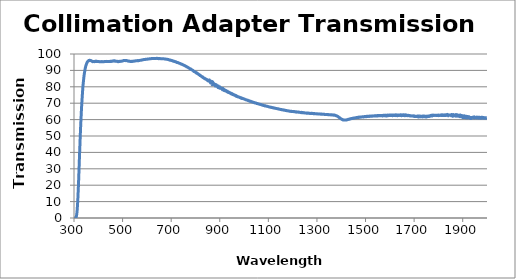
| Category | Collimation Adapter Transmission |
|---|---|
| 300.0 | 0.027 |
| 301.0 | 0.01 |
| 302.0 | 0.011 |
| 303.0 | 0.01 |
| 304.0 | 0.004 |
| 305.0 | 0.014 |
| 306.0 | 0.04 |
| 307.0 | 0.123 |
| 308.0 | 0.339 |
| 309.0 | 0.684 |
| 310.0 | 1.226 |
| 311.0 | 2.072 |
| 312.0 | 3.234 |
| 313.0 | 4.8 |
| 314.0 | 6.85 |
| 315.0 | 9.312 |
| 316.0 | 12.193 |
| 317.0 | 15.516 |
| 318.0 | 18.881 |
| 319.0 | 22.701 |
| 320.0 | 26.847 |
| 321.0 | 30.99 |
| 322.0 | 35.189 |
| 323.0 | 39.184 |
| 324.0 | 43.123 |
| 325.0 | 47.111 |
| 326.0 | 50.904 |
| 327.0 | 54.502 |
| 328.0 | 57.905 |
| 329.0 | 60.99 |
| 330.0 | 64.204 |
| 331.0 | 67.128 |
| 332.0 | 69.625 |
| 333.0 | 71.962 |
| 334.0 | 74.282 |
| 335.0 | 76.564 |
| 336.0 | 78.724 |
| 337.0 | 80.565 |
| 338.0 | 82.145 |
| 339.0 | 83.505 |
| 340.0 | 85.037 |
| 341.0 | 86.343 |
| 342.0 | 87.519 |
| 343.0 | 88.435 |
| 344.0 | 89.249 |
| 345.0 | 90.154 |
| 346.0 | 91.051 |
| 347.0 | 91.713 |
| 348.0 | 92.358 |
| 349.0 | 92.922 |
| 350.0 | 93.368 |
| 351.0 | 93.806 |
| 352.0 | 94.136 |
| 353.0 | 94.531 |
| 354.0 | 94.917 |
| 355.0 | 95.159 |
| 356.0 | 95.26 |
| 357.0 | 95.424 |
| 358.0 | 95.553 |
| 359.0 | 95.713 |
| 360.0 | 95.997 |
| 361.0 | 95.997 |
| 362.0 | 95.914 |
| 363.0 | 96.003 |
| 364.0 | 96.164 |
| 365.0 | 96.152 |
| 366.0 | 96.096 |
| 367.0 | 96.109 |
| 368.0 | 96.063 |
| 369.0 | 95.924 |
| 370.0 | 95.922 |
| 371.0 | 95.95 |
| 372.0 | 95.792 |
| 373.0 | 95.737 |
| 374.0 | 95.565 |
| 375.0 | 95.572 |
| 376.0 | 95.412 |
| 377.0 | 95.279 |
| 378.0 | 95.424 |
| 379.0 | 95.362 |
| 380.0 | 95.382 |
| 381.0 | 95.399 |
| 382.0 | 95.39 |
| 383.0 | 95.509 |
| 384.0 | 95.343 |
| 385.0 | 95.318 |
| 386.0 | 95.409 |
| 387.0 | 95.517 |
| 388.0 | 95.446 |
| 389.0 | 95.386 |
| 390.0 | 95.444 |
| 391.0 | 95.667 |
| 392.0 | 95.514 |
| 393.0 | 95.604 |
| 394.0 | 95.537 |
| 395.0 | 95.442 |
| 396.0 | 95.47 |
| 397.0 | 95.424 |
| 398.0 | 95.469 |
| 399.0 | 95.42 |
| 400.0 | 95.404 |
| 401.0 | 95.341 |
| 402.0 | 95.392 |
| 403.0 | 95.381 |
| 404.0 | 95.325 |
| 405.0 | 95.295 |
| 406.0 | 95.284 |
| 407.0 | 95.323 |
| 408.0 | 95.356 |
| 409.0 | 95.322 |
| 410.0 | 95.343 |
| 411.0 | 95.314 |
| 412.0 | 95.347 |
| 413.0 | 95.308 |
| 414.0 | 95.412 |
| 415.0 | 95.301 |
| 416.0 | 95.273 |
| 417.0 | 95.287 |
| 418.0 | 95.351 |
| 419.0 | 95.313 |
| 420.0 | 95.258 |
| 421.0 | 95.327 |
| 422.0 | 95.316 |
| 423.0 | 95.346 |
| 424.0 | 95.383 |
| 425.0 | 95.462 |
| 426.0 | 95.374 |
| 427.0 | 95.33 |
| 428.0 | 95.408 |
| 429.0 | 95.403 |
| 430.0 | 95.422 |
| 431.0 | 95.42 |
| 432.0 | 95.369 |
| 433.0 | 95.424 |
| 434.0 | 95.498 |
| 435.0 | 95.491 |
| 436.0 | 95.365 |
| 437.0 | 95.475 |
| 438.0 | 95.387 |
| 439.0 | 95.412 |
| 440.0 | 95.385 |
| 441.0 | 95.474 |
| 442.0 | 95.357 |
| 443.0 | 95.428 |
| 444.0 | 95.376 |
| 445.0 | 95.43 |
| 446.0 | 95.425 |
| 447.0 | 95.458 |
| 448.0 | 95.519 |
| 449.0 | 95.432 |
| 450.0 | 95.445 |
| 451.0 | 95.522 |
| 452.0 | 95.623 |
| 453.0 | 95.533 |
| 454.0 | 95.499 |
| 455.0 | 95.495 |
| 456.0 | 95.501 |
| 457.0 | 95.693 |
| 458.0 | 95.671 |
| 459.0 | 95.562 |
| 460.0 | 95.607 |
| 461.0 | 95.742 |
| 462.0 | 95.747 |
| 463.0 | 95.829 |
| 464.0 | 95.701 |
| 465.0 | 95.745 |
| 466.0 | 95.856 |
| 467.0 | 95.797 |
| 468.0 | 95.816 |
| 469.0 | 95.613 |
| 470.0 | 95.633 |
| 471.0 | 95.709 |
| 472.0 | 95.651 |
| 473.0 | 95.646 |
| 474.0 | 95.61 |
| 475.0 | 95.526 |
| 476.0 | 95.54 |
| 477.0 | 95.49 |
| 478.0 | 95.549 |
| 479.0 | 95.388 |
| 480.0 | 95.453 |
| 481.0 | 95.285 |
| 482.0 | 95.283 |
| 483.0 | 95.391 |
| 484.0 | 95.359 |
| 485.0 | 95.507 |
| 486.0 | 95.419 |
| 487.0 | 95.369 |
| 488.0 | 95.575 |
| 489.0 | 95.466 |
| 490.0 | 95.5 |
| 491.0 | 95.523 |
| 492.0 | 95.492 |
| 493.0 | 95.549 |
| 494.0 | 95.628 |
| 495.0 | 95.608 |
| 496.0 | 95.592 |
| 497.0 | 95.696 |
| 498.0 | 95.72 |
| 499.0 | 95.709 |
| 500.0 | 95.754 |
| 501.0 | 95.758 |
| 502.0 | 95.825 |
| 503.0 | 95.944 |
| 504.0 | 96.059 |
| 505.0 | 95.985 |
| 506.0 | 96.012 |
| 507.0 | 95.989 |
| 508.0 | 96.014 |
| 509.0 | 96.028 |
| 510.0 | 96.041 |
| 511.0 | 95.963 |
| 512.0 | 96.078 |
| 513.0 | 95.94 |
| 514.0 | 96.046 |
| 515.0 | 95.98 |
| 516.0 | 96.036 |
| 517.0 | 95.96 |
| 518.0 | 95.894 |
| 519.0 | 95.832 |
| 520.0 | 95.776 |
| 521.0 | 95.821 |
| 522.0 | 95.734 |
| 523.0 | 95.801 |
| 524.0 | 95.754 |
| 525.0 | 95.609 |
| 526.0 | 95.678 |
| 527.0 | 95.671 |
| 528.0 | 95.551 |
| 529.0 | 95.531 |
| 530.0 | 95.587 |
| 531.0 | 95.493 |
| 532.0 | 95.393 |
| 533.0 | 95.406 |
| 534.0 | 95.475 |
| 535.0 | 95.412 |
| 536.0 | 95.487 |
| 537.0 | 95.523 |
| 538.0 | 95.483 |
| 539.0 | 95.513 |
| 540.0 | 95.45 |
| 541.0 | 95.568 |
| 542.0 | 95.582 |
| 543.0 | 95.564 |
| 544.0 | 95.576 |
| 545.0 | 95.517 |
| 546.0 | 95.564 |
| 547.0 | 95.709 |
| 548.0 | 95.68 |
| 549.0 | 95.652 |
| 550.0 | 95.679 |
| 551.0 | 95.725 |
| 552.0 | 95.758 |
| 553.0 | 95.807 |
| 554.0 | 95.865 |
| 555.0 | 95.854 |
| 556.0 | 95.806 |
| 557.0 | 95.887 |
| 558.0 | 95.883 |
| 559.0 | 95.946 |
| 560.0 | 95.936 |
| 561.0 | 96.002 |
| 562.0 | 95.883 |
| 563.0 | 95.828 |
| 564.0 | 95.904 |
| 565.0 | 95.842 |
| 566.0 | 95.916 |
| 567.0 | 96.021 |
| 568.0 | 96.043 |
| 569.0 | 96.104 |
| 570.0 | 96.077 |
| 571.0 | 96.112 |
| 572.0 | 96.127 |
| 573.0 | 96.126 |
| 574.0 | 96.137 |
| 575.0 | 96.19 |
| 576.0 | 96.224 |
| 577.0 | 96.234 |
| 578.0 | 96.319 |
| 579.0 | 96.356 |
| 580.0 | 96.348 |
| 581.0 | 96.408 |
| 582.0 | 96.39 |
| 583.0 | 96.488 |
| 584.0 | 96.476 |
| 585.0 | 96.568 |
| 586.0 | 96.557 |
| 587.0 | 96.621 |
| 588.0 | 96.624 |
| 589.0 | 96.617 |
| 590.0 | 96.583 |
| 591.0 | 96.66 |
| 592.0 | 96.715 |
| 593.0 | 96.657 |
| 594.0 | 96.781 |
| 595.0 | 96.751 |
| 596.0 | 96.798 |
| 597.0 | 96.758 |
| 598.0 | 96.806 |
| 599.0 | 96.834 |
| 600.0 | 96.839 |
| 601.0 | 96.803 |
| 602.0 | 96.91 |
| 603.0 | 96.98 |
| 604.0 | 96.996 |
| 605.0 | 96.988 |
| 606.0 | 97.015 |
| 607.0 | 97.001 |
| 608.0 | 96.957 |
| 609.0 | 97.031 |
| 610.0 | 97.045 |
| 611.0 | 97.098 |
| 612.0 | 97.105 |
| 613.0 | 97.112 |
| 614.0 | 97.17 |
| 615.0 | 97.161 |
| 616.0 | 97.167 |
| 617.0 | 97.141 |
| 618.0 | 97.164 |
| 619.0 | 97.212 |
| 620.0 | 97.247 |
| 621.0 | 97.317 |
| 622.0 | 97.298 |
| 623.0 | 97.208 |
| 624.0 | 97.251 |
| 625.0 | 97.293 |
| 626.0 | 97.287 |
| 627.0 | 97.299 |
| 628.0 | 97.266 |
| 629.0 | 97.221 |
| 630.0 | 97.194 |
| 631.0 | 97.274 |
| 632.0 | 97.285 |
| 633.0 | 97.248 |
| 634.0 | 97.301 |
| 635.0 | 97.275 |
| 636.0 | 97.282 |
| 637.0 | 97.285 |
| 638.0 | 97.216 |
| 639.0 | 97.272 |
| 640.0 | 97.359 |
| 641.0 | 97.368 |
| 642.0 | 97.328 |
| 643.0 | 97.348 |
| 644.0 | 97.308 |
| 645.0 | 97.276 |
| 646.0 | 97.237 |
| 647.0 | 97.15 |
| 648.0 | 97.223 |
| 649.0 | 97.227 |
| 650.0 | 97.146 |
| 651.0 | 97.192 |
| 652.0 | 97.256 |
| 653.0 | 97.292 |
| 654.0 | 97.226 |
| 655.0 | 97.205 |
| 656.0 | 97.173 |
| 657.0 | 97.156 |
| 658.0 | 97.116 |
| 659.0 | 97.095 |
| 660.0 | 97.128 |
| 661.0 | 97.122 |
| 662.0 | 97.092 |
| 663.0 | 97.083 |
| 664.0 | 97.098 |
| 665.0 | 97.098 |
| 666.0 | 97.091 |
| 667.0 | 97.157 |
| 668.0 | 97.125 |
| 669.0 | 97.064 |
| 670.0 | 97.04 |
| 671.0 | 97.035 |
| 672.0 | 97.011 |
| 673.0 | 96.961 |
| 674.0 | 96.94 |
| 675.0 | 96.942 |
| 676.0 | 96.939 |
| 677.0 | 96.883 |
| 678.0 | 96.856 |
| 679.0 | 96.893 |
| 680.0 | 96.848 |
| 681.0 | 96.778 |
| 682.0 | 96.762 |
| 683.0 | 96.744 |
| 684.0 | 96.714 |
| 685.0 | 96.736 |
| 686.0 | 96.657 |
| 687.0 | 96.589 |
| 688.0 | 96.682 |
| 689.0 | 96.588 |
| 690.0 | 96.466 |
| 691.0 | 96.487 |
| 692.0 | 96.444 |
| 693.0 | 96.417 |
| 694.0 | 96.325 |
| 695.0 | 96.218 |
| 696.0 | 96.235 |
| 697.0 | 96.281 |
| 698.0 | 96.233 |
| 699.0 | 96.179 |
| 700.0 | 96.138 |
| 701.0 | 96.028 |
| 702.0 | 95.999 |
| 703.0 | 96.026 |
| 704.0 | 95.935 |
| 705.0 | 95.848 |
| 706.0 | 95.894 |
| 707.0 | 95.8 |
| 708.0 | 95.624 |
| 709.0 | 95.63 |
| 710.0 | 95.664 |
| 711.0 | 95.54 |
| 712.0 | 95.556 |
| 713.0 | 95.51 |
| 714.0 | 95.368 |
| 715.0 | 95.408 |
| 716.0 | 95.385 |
| 717.0 | 95.316 |
| 718.0 | 95.237 |
| 719.0 | 95.252 |
| 720.0 | 95.194 |
| 721.0 | 95.127 |
| 722.0 | 94.98 |
| 723.0 | 94.843 |
| 724.0 | 94.853 |
| 725.0 | 94.846 |
| 726.0 | 94.784 |
| 727.0 | 94.853 |
| 728.0 | 94.738 |
| 729.0 | 94.646 |
| 730.0 | 94.603 |
| 731.0 | 94.497 |
| 732.0 | 94.419 |
| 733.0 | 94.386 |
| 734.0 | 94.322 |
| 735.0 | 94.292 |
| 736.0 | 94.266 |
| 737.0 | 94.222 |
| 738.0 | 94.126 |
| 739.0 | 93.959 |
| 740.0 | 93.927 |
| 741.0 | 93.882 |
| 742.0 | 93.847 |
| 743.0 | 93.768 |
| 744.0 | 93.742 |
| 745.0 | 93.693 |
| 746.0 | 93.626 |
| 747.0 | 93.549 |
| 748.0 | 93.476 |
| 749.0 | 93.424 |
| 750.0 | 93.266 |
| 751.0 | 93.216 |
| 752.0 | 93.137 |
| 753.0 | 93.043 |
| 754.0 | 93.022 |
| 755.0 | 92.901 |
| 756.0 | 92.871 |
| 757.0 | 92.848 |
| 758.0 | 92.739 |
| 759.0 | 92.578 |
| 760.0 | 92.553 |
| 761.0 | 92.509 |
| 762.0 | 92.46 |
| 763.0 | 92.208 |
| 764.0 | 92.248 |
| 765.0 | 92.118 |
| 766.0 | 92.114 |
| 767.0 | 91.945 |
| 768.0 | 91.867 |
| 769.0 | 91.82 |
| 770.0 | 91.79 |
| 771.0 | 91.609 |
| 772.0 | 91.583 |
| 773.0 | 91.417 |
| 774.0 | 91.324 |
| 775.0 | 91.275 |
| 776.0 | 91.169 |
| 777.0 | 91.136 |
| 778.0 | 90.997 |
| 779.0 | 90.833 |
| 780.0 | 90.728 |
| 781.0 | 90.854 |
| 782.0 | 90.592 |
| 783.0 | 90.452 |
| 784.0 | 90.423 |
| 785.0 | 90.341 |
| 786.0 | 90.27 |
| 787.0 | 90.29 |
| 788.0 | 90.056 |
| 789.0 | 90.029 |
| 790.0 | 89.944 |
| 791.0 | 89.816 |
| 792.0 | 89.586 |
| 793.0 | 89.363 |
| 794.0 | 89.416 |
| 795.0 | 89.413 |
| 796.0 | 89.363 |
| 797.0 | 89.104 |
| 798.0 | 88.986 |
| 799.0 | 88.976 |
| 800.0 | 88.886 |
| 801.0 | 88.797 |
| 802.0 | 88.764 |
| 803.0 | 88.491 |
| 804.0 | 88.339 |
| 805.0 | 88.26 |
| 806.0 | 88.432 |
| 807.0 | 88.346 |
| 808.0 | 88.053 |
| 809.0 | 88.002 |
| 810.0 | 87.849 |
| 811.0 | 87.869 |
| 812.0 | 87.653 |
| 813.0 | 87.505 |
| 814.0 | 87.452 |
| 815.0 | 87.324 |
| 816.0 | 87.333 |
| 817.0 | 87.284 |
| 818.0 | 87.212 |
| 819.0 | 86.855 |
| 820.0 | 86.76 |
| 821.0 | 86.828 |
| 822.0 | 86.739 |
| 823.0 | 86.475 |
| 824.0 | 86.499 |
| 825.0 | 86.352 |
| 826.0 | 86.212 |
| 827.0 | 86.074 |
| 828.0 | 86.102 |
| 829.0 | 85.835 |
| 830.0 | 86.005 |
| 831.0 | 85.884 |
| 832.0 | 85.606 |
| 833.0 | 85.447 |
| 834.0 | 85.402 |
| 835.0 | 85.2 |
| 836.0 | 85.212 |
| 837.0 | 85.216 |
| 838.0 | 85.178 |
| 839.0 | 84.836 |
| 840.0 | 85.024 |
| 841.0 | 84.693 |
| 842.0 | 84.662 |
| 843.0 | 84.697 |
| 844.0 | 84.661 |
| 845.0 | 84.434 |
| 846.0 | 84.477 |
| 847.0 | 84.44 |
| 848.0 | 84.189 |
| 849.0 | 84.184 |
| 850.0 | 83.703 |
| 851.0 | 83.686 |
| 852.0 | 83.811 |
| 853.0 | 84.062 |
| 854.0 | 83.839 |
| 855.0 | 84.017 |
| 856.0 | 83.421 |
| 857.0 | 84.243 |
| 858.0 | 83.401 |
| 859.0 | 83.003 |
| 860.0 | 83.435 |
| 861.0 | 83.636 |
| 862.0 | 82.39 |
| 863.0 | 82.737 |
| 864.0 | 83.001 |
| 865.0 | 83.994 |
| 866.0 | 82.115 |
| 867.0 | 82.757 |
| 868.0 | 81.645 |
| 869.0 | 81.324 |
| 870.0 | 82.512 |
| 871.0 | 83.027 |
| 872.0 | 82.377 |
| 873.0 | 80.947 |
| 874.0 | 82.591 |
| 875.0 | 81.023 |
| 876.0 | 81.547 |
| 877.0 | 82.25 |
| 878.0 | 80.645 |
| 879.0 | 81.042 |
| 880.0 | 81.535 |
| 881.0 | 80.478 |
| 882.0 | 80.877 |
| 883.0 | 81.982 |
| 884.0 | 80.453 |
| 885.0 | 80.521 |
| 886.0 | 80.981 |
| 887.0 | 80.954 |
| 888.0 | 80.726 |
| 889.0 | 80.177 |
| 890.0 | 80.729 |
| 891.0 | 80.195 |
| 892.0 | 80.211 |
| 893.0 | 79.53 |
| 894.0 | 80.516 |
| 895.0 | 80.073 |
| 896.0 | 79.67 |
| 897.0 | 79.658 |
| 898.0 | 79.938 |
| 899.0 | 79.447 |
| 900.0 | 79.146 |
| 901.0 | 79.94 |
| 902.0 | 79.396 |
| 903.0 | 79.284 |
| 904.0 | 79.277 |
| 905.0 | 79.052 |
| 906.0 | 78.965 |
| 907.0 | 79.162 |
| 908.0 | 78.931 |
| 909.0 | 79.063 |
| 910.0 | 78.679 |
| 911.0 | 78.229 |
| 912.0 | 78.304 |
| 913.0 | 79.003 |
| 914.0 | 78.385 |
| 915.0 | 78.159 |
| 916.0 | 78.226 |
| 917.0 | 77.759 |
| 918.0 | 78.252 |
| 919.0 | 78.31 |
| 920.0 | 78.014 |
| 921.0 | 77.983 |
| 922.0 | 77.752 |
| 923.0 | 77.429 |
| 924.0 | 77.641 |
| 925.0 | 77.804 |
| 926.0 | 77.354 |
| 927.0 | 77.357 |
| 928.0 | 77.236 |
| 929.0 | 77.008 |
| 930.0 | 77.006 |
| 931.0 | 77.363 |
| 932.0 | 77.093 |
| 933.0 | 76.889 |
| 934.0 | 76.739 |
| 935.0 | 76.525 |
| 936.0 | 76.814 |
| 937.0 | 76.662 |
| 938.0 | 76.502 |
| 939.0 | 76.433 |
| 940.0 | 76.616 |
| 941.0 | 76.16 |
| 942.0 | 76.33 |
| 943.0 | 76.244 |
| 944.0 | 76.251 |
| 945.0 | 75.971 |
| 946.0 | 75.706 |
| 947.0 | 75.933 |
| 948.0 | 75.867 |
| 949.0 | 75.972 |
| 950.0 | 75.736 |
| 951.0 | 75.383 |
| 952.0 | 75.63 |
| 953.0 | 75.35 |
| 954.0 | 75.42 |
| 955.0 | 75.486 |
| 956.0 | 75.237 |
| 957.0 | 75.062 |
| 958.0 | 75.15 |
| 959.0 | 74.99 |
| 960.0 | 75.026 |
| 961.0 | 74.997 |
| 962.0 | 74.809 |
| 963.0 | 74.722 |
| 964.0 | 74.817 |
| 965.0 | 74.439 |
| 966.0 | 74.589 |
| 967.0 | 74.654 |
| 968.0 | 74.456 |
| 969.0 | 74.156 |
| 970.0 | 74.331 |
| 971.0 | 74.147 |
| 972.0 | 74.106 |
| 973.0 | 74.134 |
| 974.0 | 73.96 |
| 975.0 | 73.81 |
| 976.0 | 73.968 |
| 977.0 | 73.743 |
| 978.0 | 73.706 |
| 979.0 | 73.776 |
| 980.0 | 73.69 |
| 981.0 | 73.688 |
| 982.0 | 73.524 |
| 983.0 | 73.377 |
| 984.0 | 73.475 |
| 985.0 | 73.409 |
| 986.0 | 73.333 |
| 987.0 | 73.374 |
| 988.0 | 73.187 |
| 989.0 | 72.931 |
| 990.0 | 73.022 |
| 991.0 | 73.077 |
| 992.0 | 72.983 |
| 993.0 | 72.916 |
| 994.0 | 72.965 |
| 995.0 | 72.815 |
| 996.0 | 72.74 |
| 997.0 | 72.741 |
| 998.0 | 72.692 |
| 999.0 | 72.695 |
| 1000.0 | 72.593 |
| 1001.0 | 72.455 |
| 1002.0 | 72.452 |
| 1003.0 | 72.462 |
| 1004.0 | 72.299 |
| 1005.0 | 72.254 |
| 1006.0 | 72.161 |
| 1007.0 | 72.043 |
| 1008.0 | 72.177 |
| 1009.0 | 72.066 |
| 1010.0 | 72.048 |
| 1011.0 | 71.966 |
| 1012.0 | 71.89 |
| 1013.0 | 71.823 |
| 1014.0 | 71.722 |
| 1015.0 | 71.852 |
| 1016.0 | 71.665 |
| 1017.0 | 71.557 |
| 1018.0 | 71.513 |
| 1019.0 | 71.507 |
| 1020.0 | 71.47 |
| 1021.0 | 71.47 |
| 1022.0 | 71.419 |
| 1023.0 | 71.202 |
| 1024.0 | 71.181 |
| 1025.0 | 71.203 |
| 1026.0 | 71.091 |
| 1027.0 | 71.19 |
| 1028.0 | 71.121 |
| 1029.0 | 70.936 |
| 1030.0 | 70.972 |
| 1031.0 | 70.945 |
| 1032.0 | 70.855 |
| 1033.0 | 70.844 |
| 1034.0 | 70.787 |
| 1035.0 | 70.641 |
| 1036.0 | 70.562 |
| 1037.0 | 70.588 |
| 1038.0 | 70.608 |
| 1039.0 | 70.561 |
| 1040.0 | 70.429 |
| 1041.0 | 70.4 |
| 1042.0 | 70.402 |
| 1043.0 | 70.207 |
| 1044.0 | 70.192 |
| 1045.0 | 70.276 |
| 1046.0 | 70.214 |
| 1047.0 | 70.164 |
| 1048.0 | 70.107 |
| 1049.0 | 70.109 |
| 1050.0 | 70.047 |
| 1051.0 | 69.952 |
| 1052.0 | 69.797 |
| 1053.0 | 69.818 |
| 1054.0 | 69.887 |
| 1055.0 | 69.787 |
| 1056.0 | 69.733 |
| 1057.0 | 69.633 |
| 1058.0 | 69.602 |
| 1059.0 | 69.608 |
| 1060.0 | 69.571 |
| 1061.0 | 69.55 |
| 1062.0 | 69.474 |
| 1063.0 | 69.361 |
| 1064.0 | 69.314 |
| 1065.0 | 69.335 |
| 1066.0 | 69.315 |
| 1067.0 | 69.213 |
| 1068.0 | 69.139 |
| 1069.0 | 69.205 |
| 1070.0 | 69.16 |
| 1071.0 | 69.075 |
| 1072.0 | 68.97 |
| 1073.0 | 68.934 |
| 1074.0 | 68.968 |
| 1075.0 | 68.842 |
| 1076.0 | 68.785 |
| 1077.0 | 68.873 |
| 1078.0 | 68.776 |
| 1079.0 | 68.648 |
| 1080.0 | 68.659 |
| 1081.0 | 68.637 |
| 1082.0 | 68.577 |
| 1083.0 | 68.541 |
| 1084.0 | 68.457 |
| 1085.0 | 68.487 |
| 1086.0 | 68.448 |
| 1087.0 | 68.29 |
| 1088.0 | 68.34 |
| 1089.0 | 68.399 |
| 1090.0 | 68.242 |
| 1091.0 | 68.21 |
| 1092.0 | 68.216 |
| 1093.0 | 68.163 |
| 1094.0 | 68.206 |
| 1095.0 | 68.164 |
| 1096.0 | 68.067 |
| 1097.0 | 68.038 |
| 1098.0 | 68.007 |
| 1099.0 | 67.948 |
| 1100.0 | 67.918 |
| 1101.0 | 67.842 |
| 1102.0 | 67.803 |
| 1103.0 | 67.743 |
| 1104.0 | 67.741 |
| 1105.0 | 67.67 |
| 1106.0 | 67.673 |
| 1107.0 | 67.604 |
| 1108.0 | 67.569 |
| 1109.0 | 67.517 |
| 1110.0 | 67.539 |
| 1111.0 | 67.462 |
| 1112.0 | 67.41 |
| 1113.0 | 67.462 |
| 1114.0 | 67.373 |
| 1115.0 | 67.303 |
| 1116.0 | 67.357 |
| 1117.0 | 67.294 |
| 1118.0 | 67.22 |
| 1119.0 | 67.192 |
| 1120.0 | 67.144 |
| 1121.0 | 67.13 |
| 1122.0 | 67.187 |
| 1123.0 | 67.058 |
| 1124.0 | 67.031 |
| 1125.0 | 67.078 |
| 1126.0 | 66.97 |
| 1127.0 | 66.892 |
| 1128.0 | 66.958 |
| 1129.0 | 66.884 |
| 1130.0 | 66.859 |
| 1131.0 | 66.834 |
| 1132.0 | 66.791 |
| 1133.0 | 66.726 |
| 1134.0 | 66.726 |
| 1135.0 | 66.729 |
| 1136.0 | 66.661 |
| 1137.0 | 66.671 |
| 1138.0 | 66.609 |
| 1139.0 | 66.519 |
| 1140.0 | 66.608 |
| 1141.0 | 66.531 |
| 1142.0 | 66.431 |
| 1143.0 | 66.454 |
| 1144.0 | 66.362 |
| 1145.0 | 66.33 |
| 1146.0 | 66.389 |
| 1147.0 | 66.277 |
| 1148.0 | 66.248 |
| 1149.0 | 66.236 |
| 1150.0 | 66.205 |
| 1151.0 | 66.135 |
| 1152.0 | 66.201 |
| 1153.0 | 66.068 |
| 1154.0 | 66.134 |
| 1155.0 | 66.074 |
| 1156.0 | 66.059 |
| 1157.0 | 65.934 |
| 1158.0 | 66.029 |
| 1159.0 | 65.978 |
| 1160.0 | 65.881 |
| 1161.0 | 65.95 |
| 1162.0 | 65.848 |
| 1163.0 | 65.762 |
| 1164.0 | 65.775 |
| 1165.0 | 65.73 |
| 1166.0 | 65.77 |
| 1167.0 | 65.8 |
| 1168.0 | 65.687 |
| 1169.0 | 65.698 |
| 1170.0 | 65.612 |
| 1171.0 | 65.595 |
| 1172.0 | 65.495 |
| 1173.0 | 65.572 |
| 1174.0 | 65.574 |
| 1175.0 | 65.44 |
| 1176.0 | 65.435 |
| 1177.0 | 65.431 |
| 1178.0 | 65.432 |
| 1179.0 | 65.419 |
| 1180.0 | 65.394 |
| 1181.0 | 65.298 |
| 1182.0 | 65.252 |
| 1183.0 | 65.291 |
| 1184.0 | 65.278 |
| 1185.0 | 65.244 |
| 1186.0 | 65.203 |
| 1187.0 | 65.13 |
| 1188.0 | 65.163 |
| 1189.0 | 65.153 |
| 1190.0 | 65.144 |
| 1191.0 | 65.103 |
| 1192.0 | 64.999 |
| 1193.0 | 65.037 |
| 1194.0 | 65.049 |
| 1195.0 | 64.96 |
| 1196.0 | 65.028 |
| 1197.0 | 65.005 |
| 1198.0 | 64.991 |
| 1199.0 | 64.957 |
| 1200.0 | 64.911 |
| 1201.0 | 64.945 |
| 1202.0 | 64.936 |
| 1203.0 | 64.93 |
| 1204.0 | 64.868 |
| 1205.0 | 64.881 |
| 1206.0 | 64.808 |
| 1207.0 | 64.883 |
| 1208.0 | 64.76 |
| 1209.0 | 64.734 |
| 1210.0 | 64.739 |
| 1211.0 | 64.711 |
| 1212.0 | 64.672 |
| 1213.0 | 64.739 |
| 1214.0 | 64.619 |
| 1215.0 | 64.799 |
| 1216.0 | 64.55 |
| 1217.0 | 64.596 |
| 1218.0 | 64.673 |
| 1219.0 | 64.586 |
| 1220.0 | 64.614 |
| 1221.0 | 64.616 |
| 1222.0 | 64.537 |
| 1223.0 | 64.495 |
| 1224.0 | 64.622 |
| 1225.0 | 64.596 |
| 1226.0 | 64.552 |
| 1227.0 | 64.413 |
| 1228.0 | 64.464 |
| 1229.0 | 64.433 |
| 1230.0 | 64.413 |
| 1231.0 | 64.364 |
| 1232.0 | 64.392 |
| 1233.0 | 64.393 |
| 1234.0 | 64.309 |
| 1235.0 | 64.232 |
| 1236.0 | 64.435 |
| 1237.0 | 64.286 |
| 1238.0 | 64.335 |
| 1239.0 | 64.299 |
| 1240.0 | 64.159 |
| 1241.0 | 64.296 |
| 1242.0 | 64.332 |
| 1243.0 | 64.184 |
| 1244.0 | 64.134 |
| 1245.0 | 64.131 |
| 1246.0 | 64.088 |
| 1247.0 | 64.181 |
| 1248.0 | 64.168 |
| 1249.0 | 64.142 |
| 1250.0 | 64.071 |
| 1251.0 | 63.979 |
| 1252.0 | 64.025 |
| 1253.0 | 63.948 |
| 1254.0 | 64.063 |
| 1255.0 | 64.014 |
| 1256.0 | 64.058 |
| 1257.0 | 63.902 |
| 1258.0 | 63.921 |
| 1259.0 | 63.928 |
| 1260.0 | 64.062 |
| 1261.0 | 63.951 |
| 1262.0 | 63.872 |
| 1263.0 | 63.959 |
| 1264.0 | 63.838 |
| 1265.0 | 63.915 |
| 1266.0 | 63.958 |
| 1267.0 | 63.866 |
| 1268.0 | 63.841 |
| 1269.0 | 63.877 |
| 1270.0 | 63.744 |
| 1271.0 | 63.83 |
| 1272.0 | 63.816 |
| 1273.0 | 63.751 |
| 1274.0 | 63.7 |
| 1275.0 | 63.792 |
| 1276.0 | 63.689 |
| 1277.0 | 63.841 |
| 1278.0 | 63.861 |
| 1279.0 | 63.717 |
| 1280.0 | 63.825 |
| 1281.0 | 63.797 |
| 1282.0 | 63.729 |
| 1283.0 | 63.757 |
| 1284.0 | 63.726 |
| 1285.0 | 63.609 |
| 1286.0 | 63.637 |
| 1287.0 | 63.673 |
| 1288.0 | 63.629 |
| 1289.0 | 63.666 |
| 1290.0 | 63.68 |
| 1291.0 | 63.575 |
| 1292.0 | 63.582 |
| 1293.0 | 63.593 |
| 1294.0 | 63.547 |
| 1295.0 | 63.627 |
| 1296.0 | 63.605 |
| 1297.0 | 63.465 |
| 1298.0 | 63.561 |
| 1299.0 | 63.575 |
| 1300.0 | 63.529 |
| 1301.0 | 63.579 |
| 1302.0 | 63.514 |
| 1303.0 | 63.425 |
| 1304.0 | 63.464 |
| 1305.0 | 63.485 |
| 1306.0 | 63.407 |
| 1307.0 | 63.429 |
| 1308.0 | 63.519 |
| 1309.0 | 63.426 |
| 1310.0 | 63.437 |
| 1311.0 | 63.402 |
| 1312.0 | 63.405 |
| 1313.0 | 63.467 |
| 1314.0 | 63.413 |
| 1315.0 | 63.326 |
| 1316.0 | 63.343 |
| 1317.0 | 63.356 |
| 1318.0 | 63.323 |
| 1319.0 | 63.403 |
| 1320.0 | 63.36 |
| 1321.0 | 63.232 |
| 1322.0 | 63.268 |
| 1323.0 | 63.317 |
| 1324.0 | 63.286 |
| 1325.0 | 63.294 |
| 1326.0 | 63.34 |
| 1327.0 | 63.235 |
| 1328.0 | 63.195 |
| 1329.0 | 63.256 |
| 1330.0 | 63.165 |
| 1331.0 | 63.204 |
| 1332.0 | 63.195 |
| 1333.0 | 63.135 |
| 1334.0 | 63.147 |
| 1335.0 | 63.124 |
| 1336.0 | 63.086 |
| 1337.0 | 63.098 |
| 1338.0 | 63.162 |
| 1339.0 | 63.088 |
| 1340.0 | 63.054 |
| 1341.0 | 63.116 |
| 1342.0 | 63.09 |
| 1343.0 | 63.081 |
| 1344.0 | 63.091 |
| 1345.0 | 63.013 |
| 1346.0 | 62.945 |
| 1347.0 | 62.98 |
| 1348.0 | 62.959 |
| 1349.0 | 63.052 |
| 1350.0 | 62.988 |
| 1351.0 | 62.932 |
| 1352.0 | 62.951 |
| 1353.0 | 62.96 |
| 1354.0 | 62.947 |
| 1355.0 | 62.968 |
| 1356.0 | 62.953 |
| 1357.0 | 62.878 |
| 1358.0 | 62.81 |
| 1359.0 | 62.891 |
| 1360.0 | 62.876 |
| 1361.0 | 62.917 |
| 1362.0 | 62.946 |
| 1363.0 | 62.888 |
| 1364.0 | 62.829 |
| 1365.0 | 62.813 |
| 1366.0 | 62.789 |
| 1367.0 | 62.892 |
| 1368.0 | 62.823 |
| 1369.0 | 62.689 |
| 1370.0 | 62.674 |
| 1371.0 | 62.812 |
| 1372.0 | 62.774 |
| 1373.0 | 62.696 |
| 1374.0 | 62.713 |
| 1375.0 | 62.608 |
| 1376.0 | 62.531 |
| 1377.0 | 62.532 |
| 1378.0 | 62.389 |
| 1379.0 | 62.376 |
| 1380.0 | 62.371 |
| 1381.0 | 62.223 |
| 1382.0 | 62.285 |
| 1383.0 | 62.147 |
| 1384.0 | 62.008 |
| 1385.0 | 61.97 |
| 1386.0 | 61.879 |
| 1387.0 | 61.772 |
| 1388.0 | 61.737 |
| 1389.0 | 61.609 |
| 1390.0 | 61.382 |
| 1391.0 | 61.302 |
| 1392.0 | 61.277 |
| 1393.0 | 61.151 |
| 1394.0 | 61.12 |
| 1395.0 | 60.972 |
| 1396.0 | 60.794 |
| 1397.0 | 60.671 |
| 1398.0 | 60.546 |
| 1399.0 | 60.509 |
| 1400.0 | 60.388 |
| 1401.0 | 60.319 |
| 1402.0 | 60.234 |
| 1403.0 | 60.126 |
| 1404.0 | 59.992 |
| 1405.0 | 60.03 |
| 1406.0 | 60.03 |
| 1407.0 | 59.826 |
| 1408.0 | 59.726 |
| 1409.0 | 59.741 |
| 1410.0 | 59.722 |
| 1411.0 | 59.781 |
| 1412.0 | 59.706 |
| 1413.0 | 59.7 |
| 1414.0 | 59.744 |
| 1415.0 | 59.74 |
| 1416.0 | 59.71 |
| 1417.0 | 59.77 |
| 1418.0 | 59.814 |
| 1419.0 | 59.775 |
| 1420.0 | 59.766 |
| 1421.0 | 59.794 |
| 1422.0 | 59.782 |
| 1423.0 | 59.904 |
| 1424.0 | 59.971 |
| 1425.0 | 59.911 |
| 1426.0 | 59.962 |
| 1427.0 | 60.033 |
| 1428.0 | 60.033 |
| 1429.0 | 60.177 |
| 1430.0 | 60.205 |
| 1431.0 | 60.176 |
| 1432.0 | 60.21 |
| 1433.0 | 60.204 |
| 1434.0 | 60.241 |
| 1435.0 | 60.404 |
| 1436.0 | 60.48 |
| 1437.0 | 60.38 |
| 1438.0 | 60.431 |
| 1439.0 | 60.502 |
| 1440.0 | 60.508 |
| 1441.0 | 60.664 |
| 1442.0 | 60.616 |
| 1443.0 | 60.596 |
| 1444.0 | 60.649 |
| 1445.0 | 60.636 |
| 1446.0 | 60.716 |
| 1447.0 | 60.835 |
| 1448.0 | 60.875 |
| 1449.0 | 60.794 |
| 1450.0 | 60.736 |
| 1451.0 | 60.909 |
| 1452.0 | 60.974 |
| 1453.0 | 60.983 |
| 1454.0 | 61.04 |
| 1455.0 | 61.04 |
| 1456.0 | 61.014 |
| 1457.0 | 61.033 |
| 1458.0 | 61.14 |
| 1459.0 | 61.166 |
| 1460.0 | 61.082 |
| 1461.0 | 61.076 |
| 1462.0 | 61.182 |
| 1463.0 | 61.261 |
| 1464.0 | 61.289 |
| 1465.0 | 61.306 |
| 1466.0 | 61.215 |
| 1467.0 | 61.26 |
| 1468.0 | 61.263 |
| 1469.0 | 61.299 |
| 1470.0 | 61.477 |
| 1471.0 | 61.532 |
| 1472.0 | 61.413 |
| 1473.0 | 61.309 |
| 1474.0 | 61.427 |
| 1475.0 | 61.53 |
| 1476.0 | 61.533 |
| 1477.0 | 61.505 |
| 1478.0 | 61.451 |
| 1479.0 | 61.553 |
| 1480.0 | 61.618 |
| 1481.0 | 61.578 |
| 1482.0 | 61.523 |
| 1483.0 | 61.522 |
| 1484.0 | 61.501 |
| 1485.0 | 61.561 |
| 1486.0 | 61.703 |
| 1487.0 | 61.75 |
| 1488.0 | 61.73 |
| 1489.0 | 61.7 |
| 1490.0 | 61.744 |
| 1491.0 | 61.622 |
| 1492.0 | 61.622 |
| 1493.0 | 61.757 |
| 1494.0 | 61.794 |
| 1495.0 | 61.692 |
| 1496.0 | 61.868 |
| 1497.0 | 61.767 |
| 1498.0 | 61.696 |
| 1499.0 | 61.864 |
| 1500.0 | 61.884 |
| 1501.0 | 61.812 |
| 1502.0 | 61.92 |
| 1503.0 | 61.804 |
| 1504.0 | 61.821 |
| 1505.0 | 61.996 |
| 1506.0 | 61.92 |
| 1507.0 | 61.832 |
| 1508.0 | 62.069 |
| 1509.0 | 61.9 |
| 1510.0 | 61.973 |
| 1511.0 | 62.015 |
| 1512.0 | 61.973 |
| 1513.0 | 61.966 |
| 1514.0 | 61.958 |
| 1515.0 | 61.868 |
| 1516.0 | 62.088 |
| 1517.0 | 62.119 |
| 1518.0 | 62.171 |
| 1519.0 | 61.992 |
| 1520.0 | 62.059 |
| 1521.0 | 62.052 |
| 1522.0 | 62.126 |
| 1523.0 | 62.064 |
| 1524.0 | 62.171 |
| 1525.0 | 62.033 |
| 1526.0 | 62.181 |
| 1527.0 | 62.226 |
| 1528.0 | 62.099 |
| 1529.0 | 62.178 |
| 1530.0 | 62.114 |
| 1531.0 | 62.288 |
| 1532.0 | 62.207 |
| 1533.0 | 62.144 |
| 1534.0 | 62.226 |
| 1535.0 | 62.254 |
| 1536.0 | 62.149 |
| 1537.0 | 62.358 |
| 1538.0 | 62.261 |
| 1539.0 | 62.234 |
| 1540.0 | 62.235 |
| 1541.0 | 62.284 |
| 1542.0 | 62.173 |
| 1543.0 | 62.417 |
| 1544.0 | 62.349 |
| 1545.0 | 62.24 |
| 1546.0 | 62.349 |
| 1547.0 | 62.298 |
| 1548.0 | 62.154 |
| 1549.0 | 62.437 |
| 1550.0 | 62.383 |
| 1551.0 | 62.319 |
| 1552.0 | 62.423 |
| 1553.0 | 62.474 |
| 1554.0 | 62.266 |
| 1555.0 | 62.442 |
| 1556.0 | 62.315 |
| 1557.0 | 62.369 |
| 1558.0 | 62.506 |
| 1559.0 | 62.315 |
| 1560.0 | 62.482 |
| 1561.0 | 62.37 |
| 1562.0 | 62.388 |
| 1563.0 | 62.464 |
| 1564.0 | 62.388 |
| 1565.0 | 62.476 |
| 1566.0 | 62.514 |
| 1567.0 | 62.493 |
| 1568.0 | 62.53 |
| 1569.0 | 62.378 |
| 1570.0 | 62.221 |
| 1571.0 | 62.559 |
| 1572.0 | 62.54 |
| 1573.0 | 62.629 |
| 1574.0 | 62.609 |
| 1575.0 | 62.32 |
| 1576.0 | 62.533 |
| 1577.0 | 62.72 |
| 1578.0 | 62.474 |
| 1579.0 | 62.507 |
| 1580.0 | 62.596 |
| 1581.0 | 62.276 |
| 1582.0 | 62.468 |
| 1583.0 | 62.718 |
| 1584.0 | 62.68 |
| 1585.0 | 62.591 |
| 1586.0 | 62.595 |
| 1587.0 | 62.156 |
| 1588.0 | 62.665 |
| 1589.0 | 62.666 |
| 1590.0 | 62.53 |
| 1591.0 | 62.741 |
| 1592.0 | 62.36 |
| 1593.0 | 62.467 |
| 1594.0 | 62.62 |
| 1595.0 | 62.649 |
| 1596.0 | 62.609 |
| 1597.0 | 62.814 |
| 1598.0 | 62.506 |
| 1599.0 | 62.468 |
| 1600.0 | 62.673 |
| 1601.0 | 62.814 |
| 1602.0 | 62.694 |
| 1603.0 | 62.53 |
| 1604.0 | 62.625 |
| 1605.0 | 62.682 |
| 1606.0 | 62.761 |
| 1607.0 | 62.505 |
| 1608.0 | 62.668 |
| 1609.0 | 62.512 |
| 1610.0 | 62.798 |
| 1611.0 | 62.394 |
| 1612.0 | 62.51 |
| 1613.0 | 62.717 |
| 1614.0 | 62.792 |
| 1615.0 | 62.549 |
| 1616.0 | 62.489 |
| 1617.0 | 62.54 |
| 1618.0 | 62.69 |
| 1619.0 | 62.799 |
| 1620.0 | 62.552 |
| 1621.0 | 62.624 |
| 1622.0 | 62.75 |
| 1623.0 | 62.422 |
| 1624.0 | 62.661 |
| 1625.0 | 62.95 |
| 1626.0 | 62.517 |
| 1627.0 | 62.932 |
| 1628.0 | 62.519 |
| 1629.0 | 62.607 |
| 1630.0 | 62.646 |
| 1631.0 | 62.358 |
| 1632.0 | 62.819 |
| 1633.0 | 62.521 |
| 1634.0 | 62.662 |
| 1635.0 | 62.834 |
| 1636.0 | 62.529 |
| 1637.0 | 62.639 |
| 1638.0 | 62.743 |
| 1639.0 | 62.762 |
| 1640.0 | 62.704 |
| 1641.0 | 62.832 |
| 1642.0 | 62.532 |
| 1643.0 | 62.53 |
| 1644.0 | 62.923 |
| 1645.0 | 62.771 |
| 1646.0 | 62.66 |
| 1647.0 | 62.781 |
| 1648.0 | 62.361 |
| 1649.0 | 62.694 |
| 1650.0 | 62.909 |
| 1651.0 | 62.662 |
| 1652.0 | 62.586 |
| 1653.0 | 62.601 |
| 1654.0 | 62.46 |
| 1655.0 | 62.719 |
| 1656.0 | 62.925 |
| 1657.0 | 62.544 |
| 1658.0 | 62.694 |
| 1659.0 | 62.705 |
| 1660.0 | 62.632 |
| 1661.0 | 62.391 |
| 1662.0 | 62.55 |
| 1663.0 | 62.918 |
| 1664.0 | 62.856 |
| 1665.0 | 62.826 |
| 1666.0 | 62.356 |
| 1667.0 | 62.762 |
| 1668.0 | 62.82 |
| 1669.0 | 62.762 |
| 1670.0 | 62.66 |
| 1671.0 | 62.502 |
| 1672.0 | 62.442 |
| 1673.0 | 62.398 |
| 1674.0 | 62.51 |
| 1675.0 | 62.592 |
| 1676.0 | 62.601 |
| 1677.0 | 62.514 |
| 1678.0 | 62.548 |
| 1679.0 | 62.395 |
| 1680.0 | 62.334 |
| 1681.0 | 62.456 |
| 1682.0 | 62.488 |
| 1683.0 | 62.36 |
| 1684.0 | 62.155 |
| 1685.0 | 62.237 |
| 1686.0 | 62.306 |
| 1687.0 | 62.316 |
| 1688.0 | 62.225 |
| 1689.0 | 62.207 |
| 1690.0 | 62.259 |
| 1691.0 | 62.126 |
| 1692.0 | 62.222 |
| 1693.0 | 62.293 |
| 1694.0 | 62.204 |
| 1695.0 | 62.242 |
| 1696.0 | 62.191 |
| 1697.0 | 62.005 |
| 1698.0 | 62.173 |
| 1699.0 | 62.345 |
| 1700.0 | 61.935 |
| 1701.0 | 62.013 |
| 1702.0 | 62.108 |
| 1703.0 | 61.904 |
| 1704.0 | 61.891 |
| 1705.0 | 61.967 |
| 1706.0 | 61.894 |
| 1707.0 | 62.108 |
| 1708.0 | 61.963 |
| 1709.0 | 61.857 |
| 1710.0 | 61.999 |
| 1711.0 | 61.982 |
| 1712.0 | 62.078 |
| 1713.0 | 62.128 |
| 1714.0 | 62.049 |
| 1715.0 | 61.724 |
| 1716.0 | 61.774 |
| 1717.0 | 62.194 |
| 1718.0 | 62.119 |
| 1719.0 | 61.546 |
| 1720.0 | 61.901 |
| 1721.0 | 61.926 |
| 1722.0 | 61.887 |
| 1723.0 | 62.177 |
| 1724.0 | 62.204 |
| 1725.0 | 61.819 |
| 1726.0 | 61.933 |
| 1727.0 | 61.704 |
| 1728.0 | 61.688 |
| 1729.0 | 62.068 |
| 1730.0 | 62.043 |
| 1731.0 | 62.058 |
| 1732.0 | 61.804 |
| 1733.0 | 61.712 |
| 1734.0 | 61.941 |
| 1735.0 | 61.569 |
| 1736.0 | 61.977 |
| 1737.0 | 62.226 |
| 1738.0 | 61.854 |
| 1739.0 | 61.755 |
| 1740.0 | 61.963 |
| 1741.0 | 62.198 |
| 1742.0 | 61.828 |
| 1743.0 | 61.979 |
| 1744.0 | 61.768 |
| 1745.0 | 61.833 |
| 1746.0 | 61.632 |
| 1747.0 | 61.993 |
| 1748.0 | 62.03 |
| 1749.0 | 61.787 |
| 1750.0 | 61.938 |
| 1751.0 | 61.594 |
| 1752.0 | 61.74 |
| 1753.0 | 62.112 |
| 1754.0 | 61.949 |
| 1755.0 | 62.01 |
| 1756.0 | 62.07 |
| 1757.0 | 61.91 |
| 1758.0 | 61.972 |
| 1759.0 | 62.24 |
| 1760.0 | 62.175 |
| 1761.0 | 61.908 |
| 1762.0 | 62.156 |
| 1763.0 | 62.179 |
| 1764.0 | 61.954 |
| 1765.0 | 62.269 |
| 1766.0 | 62.422 |
| 1767.0 | 62.375 |
| 1768.0 | 62.515 |
| 1769.0 | 62.181 |
| 1770.0 | 62.538 |
| 1771.0 | 62.63 |
| 1772.0 | 62.663 |
| 1773.0 | 62.55 |
| 1774.0 | 62.216 |
| 1775.0 | 62.373 |
| 1776.0 | 62.574 |
| 1777.0 | 62.592 |
| 1778.0 | 62.776 |
| 1779.0 | 62.672 |
| 1780.0 | 62.449 |
| 1781.0 | 62.459 |
| 1782.0 | 62.556 |
| 1783.0 | 62.697 |
| 1784.0 | 62.712 |
| 1785.0 | 62.59 |
| 1786.0 | 62.563 |
| 1787.0 | 62.678 |
| 1788.0 | 62.652 |
| 1789.0 | 62.6 |
| 1790.0 | 62.599 |
| 1791.0 | 62.481 |
| 1792.0 | 62.664 |
| 1793.0 | 62.536 |
| 1794.0 | 62.552 |
| 1795.0 | 62.675 |
| 1796.0 | 62.735 |
| 1797.0 | 62.658 |
| 1798.0 | 62.51 |
| 1799.0 | 62.409 |
| 1800.0 | 62.613 |
| 1801.0 | 62.775 |
| 1802.0 | 62.647 |
| 1803.0 | 62.575 |
| 1804.0 | 62.525 |
| 1805.0 | 62.556 |
| 1806.0 | 62.697 |
| 1807.0 | 62.762 |
| 1808.0 | 62.679 |
| 1809.0 | 62.599 |
| 1810.0 | 62.515 |
| 1811.0 | 62.522 |
| 1812.0 | 62.812 |
| 1813.0 | 62.939 |
| 1814.0 | 62.769 |
| 1815.0 | 62.566 |
| 1816.0 | 62.488 |
| 1817.0 | 62.58 |
| 1818.0 | 62.887 |
| 1819.0 | 62.813 |
| 1820.0 | 62.513 |
| 1821.0 | 62.718 |
| 1822.0 | 62.63 |
| 1823.0 | 62.481 |
| 1824.0 | 62.854 |
| 1825.0 | 62.893 |
| 1826.0 | 62.783 |
| 1827.0 | 62.719 |
| 1828.0 | 62.519 |
| 1829.0 | 62.56 |
| 1830.0 | 62.887 |
| 1831.0 | 62.83 |
| 1832.0 | 62.584 |
| 1833.0 | 62.569 |
| 1834.0 | 62.642 |
| 1835.0 | 62.635 |
| 1836.0 | 63.025 |
| 1837.0 | 63.174 |
| 1838.0 | 62.904 |
| 1839.0 | 62.713 |
| 1840.0 | 62.399 |
| 1841.0 | 62.307 |
| 1842.0 | 62.573 |
| 1843.0 | 62.743 |
| 1844.0 | 62.73 |
| 1845.0 | 62.713 |
| 1846.0 | 62.808 |
| 1847.0 | 62.739 |
| 1848.0 | 62.777 |
| 1849.0 | 62.828 |
| 1850.0 | 62.772 |
| 1851.0 | 62.684 |
| 1852.0 | 62.38 |
| 1853.0 | 62.485 |
| 1854.0 | 63.075 |
| 1855.0 | 63.067 |
| 1856.0 | 62.345 |
| 1857.0 | 62.643 |
| 1858.0 | 62.223 |
| 1859.0 | 62.011 |
| 1860.0 | 62.896 |
| 1861.0 | 63.071 |
| 1862.0 | 62.628 |
| 1863.0 | 62.517 |
| 1864.0 | 62.585 |
| 1865.0 | 62.785 |
| 1866.0 | 62.871 |
| 1867.0 | 62.853 |
| 1868.0 | 62.575 |
| 1869.0 | 62.524 |
| 1870.0 | 62.064 |
| 1871.0 | 62.558 |
| 1872.0 | 63.063 |
| 1873.0 | 62.937 |
| 1874.0 | 62.39 |
| 1875.0 | 62.417 |
| 1876.0 | 62.084 |
| 1877.0 | 62.546 |
| 1878.0 | 62.895 |
| 1879.0 | 62.269 |
| 1880.0 | 62.222 |
| 1881.0 | 62.421 |
| 1882.0 | 62.015 |
| 1883.0 | 62.411 |
| 1884.0 | 62.601 |
| 1885.0 | 62.57 |
| 1886.0 | 62.421 |
| 1887.0 | 62.26 |
| 1888.0 | 61.804 |
| 1889.0 | 62.102 |
| 1890.0 | 62.817 |
| 1891.0 | 62.466 |
| 1892.0 | 61.763 |
| 1893.0 | 61.984 |
| 1894.0 | 61.904 |
| 1895.0 | 62.267 |
| 1896.0 | 62.503 |
| 1897.0 | 62.167 |
| 1898.0 | 61.618 |
| 1899.0 | 61.821 |
| 1900.0 | 61.241 |
| 1901.0 | 62.184 |
| 1902.0 | 62.328 |
| 1903.0 | 62.197 |
| 1904.0 | 61.496 |
| 1905.0 | 61.536 |
| 1906.0 | 61.277 |
| 1907.0 | 62.304 |
| 1908.0 | 61.838 |
| 1909.0 | 61.886 |
| 1910.0 | 61.326 |
| 1911.0 | 61.453 |
| 1912.0 | 61.114 |
| 1913.0 | 61.779 |
| 1914.0 | 62.035 |
| 1915.0 | 61.976 |
| 1916.0 | 61.23 |
| 1917.0 | 61.426 |
| 1918.0 | 60.999 |
| 1919.0 | 61.848 |
| 1920.0 | 61.766 |
| 1921.0 | 61.721 |
| 1922.0 | 61.3 |
| 1923.0 | 61.26 |
| 1924.0 | 60.376 |
| 1925.0 | 61.396 |
| 1926.0 | 61.759 |
| 1927.0 | 61.513 |
| 1928.0 | 60.963 |
| 1929.0 | 61.041 |
| 1930.0 | 60.808 |
| 1931.0 | 61.121 |
| 1932.0 | 60.663 |
| 1933.0 | 61.055 |
| 1934.0 | 61.279 |
| 1935.0 | 61.266 |
| 1936.0 | 60.681 |
| 1937.0 | 61.31 |
| 1938.0 | 62.062 |
| 1939.0 | 61.12 |
| 1940.0 | 61.365 |
| 1941.0 | 61.403 |
| 1942.0 | 61.249 |
| 1943.0 | 61.452 |
| 1944.0 | 61.363 |
| 1945.0 | 61.055 |
| 1946.0 | 61.119 |
| 1947.0 | 61.676 |
| 1948.0 | 60.925 |
| 1949.0 | 61.249 |
| 1950.0 | 60.91 |
| 1951.0 | 60.937 |
| 1952.0 | 60.42 |
| 1953.0 | 61.64 |
| 1954.0 | 60.899 |
| 1955.0 | 61.441 |
| 1956.0 | 61.046 |
| 1957.0 | 61.181 |
| 1958.0 | 61.526 |
| 1959.0 | 60.989 |
| 1960.0 | 61.036 |
| 1961.0 | 61.414 |
| 1962.0 | 61.336 |
| 1963.0 | 61.098 |
| 1964.0 | 61.199 |
| 1965.0 | 61.152 |
| 1966.0 | 60.91 |
| 1967.0 | 61.468 |
| 1968.0 | 61.376 |
| 1969.0 | 60.902 |
| 1970.0 | 61.336 |
| 1971.0 | 61.301 |
| 1972.0 | 60.863 |
| 1973.0 | 61.04 |
| 1974.0 | 61.161 |
| 1975.0 | 61.231 |
| 1976.0 | 60.819 |
| 1977.0 | 61.472 |
| 1978.0 | 61.116 |
| 1979.0 | 61.072 |
| 1980.0 | 61.12 |
| 1981.0 | 61.141 |
| 1982.0 | 61.339 |
| 1983.0 | 61.272 |
| 1984.0 | 60.836 |
| 1985.0 | 61.292 |
| 1986.0 | 61.083 |
| 1987.0 | 61.169 |
| 1988.0 | 60.916 |
| 1989.0 | 61.004 |
| 1990.0 | 60.775 |
| 1991.0 | 61.16 |
| 1992.0 | 61.148 |
| 1993.0 | 61.031 |
| 1994.0 | 61.131 |
| 1995.0 | 61.103 |
| 1996.0 | 60.766 |
| 1997.0 | 61.168 |
| 1998.0 | 61.036 |
| 1999.0 | 61.042 |
| 2000.0 | 61.268 |